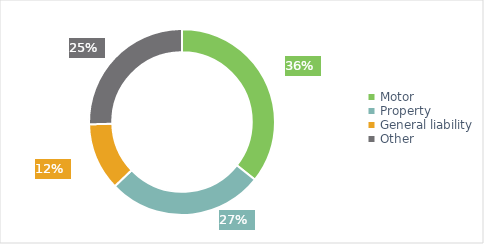
| Category | Breakdown of P&C premiums |
|---|---|
| Motor | 149.392 |
| Property | 114.046 |
| General liability | 49.202 |
| Other | 106.424 |